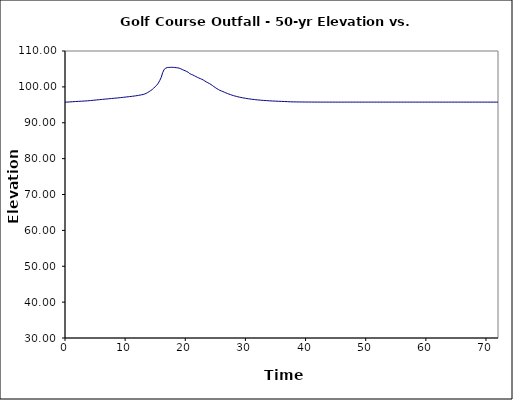
| Category | Series 1 |
|---|---|
| 0.0 | 95.75 |
| 0.25 | 95.754 |
| 0.5 | 95.771 |
| 0.75 | 95.799 |
| 1.0 | 95.83 |
| 1.25 | 95.86 |
| 1.5 | 95.888 |
| 1.75 | 95.915 |
| 2.0 | 95.94 |
| 2.25 | 95.962 |
| 2.5 | 95.985 |
| 2.75 | 96.007 |
| 3.0 | 96.029 |
| 3.25 | 96.054 |
| 3.5 | 96.084 |
| 3.75 | 96.117 |
| 4.0 | 96.154 |
| 4.25 | 96.191 |
| 4.5 | 96.232 |
| 4.75 | 96.272 |
| 5.0 | 96.313 |
| 5.25 | 96.355 |
| 5.5 | 96.395 |
| 5.75 | 96.437 |
| 6.0 | 96.479 |
| 6.25 | 96.519 |
| 6.5 | 96.561 |
| 6.75 | 96.602 |
| 7.0 | 96.642 |
| 7.25 | 96.683 |
| 7.5 | 96.722 |
| 7.75 | 96.762 |
| 8.0 | 96.801 |
| 8.25 | 96.841 |
| 8.5 | 96.88 |
| 8.75 | 96.92 |
| 9.0 | 96.962 |
| 9.25 | 97.005 |
| 9.5 | 97.051 |
| 9.75 | 97.099 |
| 10.0 | 97.148 |
| 10.25 | 97.198 |
| 10.5 | 97.244 |
| 10.75 | 97.29 |
| 11.0 | 97.336 |
| 11.25 | 97.388 |
| 11.5 | 97.444 |
| 11.75 | 97.502 |
| 12.0 | 97.568 |
| 12.25 | 97.638 |
| 12.5 | 97.715 |
| 12.75 | 97.799 |
| 13.0 | 97.891 |
| 13.25 | 98.015 |
| 13.5 | 98.196 |
| 13.75 | 98.427 |
| 14.0 | 98.688 |
| 14.25 | 98.965 |
| 14.5 | 99.263 |
| 14.75 | 99.665 |
| 15.0 | 100.061 |
| 15.25 | 100.449 |
| 15.5 | 100.999 |
| 15.75 | 101.752 |
| 16.0 | 102.668 |
| 16.25 | 104.013 |
| 16.5 | 104.884 |
| 16.75 | 105.211 |
| 17.0 | 105.377 |
| 17.25 | 105.421 |
| 17.5 | 105.449 |
| 17.75 | 105.453 |
| 18.0 | 105.442 |
| 18.25 | 105.406 |
| 18.5 | 105.355 |
| 18.75 | 105.292 |
| 19.0 | 105.213 |
| 19.25 | 105.041 |
| 19.5 | 104.818 |
| 19.75 | 104.645 |
| 20.0 | 104.481 |
| 20.25 | 104.279 |
| 20.5 | 104.048 |
| 20.75 | 103.698 |
| 21.0 | 103.483 |
| 21.25 | 103.336 |
| 21.5 | 103.101 |
| 21.75 | 102.89 |
| 22.0 | 102.678 |
| 22.25 | 102.484 |
| 22.5 | 102.301 |
| 22.75 | 102.121 |
| 23.0 | 101.901 |
| 23.25 | 101.641 |
| 23.5 | 101.389 |
| 23.75 | 101.151 |
| 24.0 | 100.926 |
| 24.25 | 100.682 |
| 24.5 | 100.392 |
| 24.75 | 100.082 |
| 25.0 | 99.788 |
| 25.25 | 99.52 |
| 25.5 | 99.269 |
| 25.75 | 99.036 |
| 26.0 | 98.86 |
| 26.25 | 98.701 |
| 26.5 | 98.508 |
| 26.75 | 98.325 |
| 27.0 | 98.156 |
| 27.25 | 97.997 |
| 27.5 | 97.849 |
| 27.75 | 97.709 |
| 28.0 | 97.575 |
| 28.25 | 97.455 |
| 28.5 | 97.343 |
| 28.75 | 97.24 |
| 29.0 | 97.142 |
| 29.25 | 97.053 |
| 29.5 | 96.968 |
| 29.75 | 96.889 |
| 30.0 | 96.815 |
| 30.25 | 96.747 |
| 30.5 | 96.683 |
| 30.75 | 96.623 |
| 31.0 | 96.565 |
| 31.25 | 96.514 |
| 31.5 | 96.464 |
| 31.75 | 96.417 |
| 32.0 | 96.376 |
| 32.25 | 96.335 |
| 32.5 | 96.297 |
| 32.75 | 96.261 |
| 33.0 | 96.228 |
| 33.25 | 96.197 |
| 33.5 | 96.168 |
| 33.75 | 96.141 |
| 34.0 | 96.114 |
| 34.25 | 96.091 |
| 34.5 | 96.067 |
| 34.75 | 96.045 |
| 35.0 | 96.025 |
| 35.25 | 96.006 |
| 35.5 | 95.987 |
| 35.75 | 95.969 |
| 36.0 | 95.954 |
| 36.25 | 95.937 |
| 36.5 | 95.922 |
| 36.75 | 95.905 |
| 37.0 | 95.883 |
| 37.25 | 95.858 |
| 37.5 | 95.837 |
| 37.75 | 95.827 |
| 38.0 | 95.818 |
| 38.25 | 95.811 |
| 38.5 | 95.804 |
| 38.75 | 95.799 |
| 39.0 | 95.793 |
| 39.25 | 95.789 |
| 39.5 | 95.785 |
| 39.75 | 95.781 |
| 40.0 | 95.778 |
| 40.25 | 95.775 |
| 40.5 | 95.772 |
| 40.75 | 95.77 |
| 41.0 | 95.768 |
| 41.25 | 95.765 |
| 41.5 | 95.764 |
| 41.75 | 95.763 |
| 42.0 | 95.761 |
| 42.25 | 95.76 |
| 42.5 | 95.758 |
| 42.75 | 95.757 |
| 43.0 | 95.756 |
| 43.25 | 95.756 |
| 43.5 | 95.754 |
| 43.75 | 95.753 |
| 44.0 | 95.753 |
| 44.25 | 95.751 |
| 44.5 | 95.751 |
| 44.75 | 95.75 |
| 45.0 | 95.75 |
| 45.25 | 95.75 |
| 45.5 | 95.75 |
| 45.75 | 95.75 |
| 46.0 | 95.75 |
| 46.25 | 95.75 |
| 46.5 | 95.75 |
| 46.75 | 95.75 |
| 47.0 | 95.75 |
| 47.25 | 95.75 |
| 47.5 | 95.75 |
| 47.75 | 95.75 |
| 48.0 | 95.75 |
| 48.25 | 95.75 |
| 48.5 | 95.75 |
| 48.75 | 95.75 |
| 49.0 | 95.75 |
| 49.25 | 95.75 |
| 49.5 | 95.75 |
| 49.75 | 95.75 |
| 50.0 | 95.75 |
| 50.25 | 95.75 |
| 50.5 | 95.75 |
| 50.75 | 95.75 |
| 51.0 | 95.75 |
| 51.25 | 95.75 |
| 51.5 | 95.75 |
| 51.75 | 95.75 |
| 52.0 | 95.75 |
| 52.25 | 95.75 |
| 52.5 | 95.75 |
| 52.75 | 95.75 |
| 53.0 | 95.75 |
| 53.25 | 95.75 |
| 53.5 | 95.75 |
| 53.75 | 95.75 |
| 54.0 | 95.75 |
| 54.25 | 95.75 |
| 54.5 | 95.75 |
| 54.75 | 95.75 |
| 55.0 | 95.75 |
| 55.25 | 95.75 |
| 55.5 | 95.75 |
| 55.75 | 95.75 |
| 56.0 | 95.75 |
| 56.25 | 95.75 |
| 56.5 | 95.75 |
| 56.75 | 95.75 |
| 57.0 | 95.75 |
| 57.25 | 95.75 |
| 57.5 | 95.75 |
| 57.75 | 95.75 |
| 58.0 | 95.75 |
| 58.25 | 95.75 |
| 58.5 | 95.75 |
| 58.75 | 95.75 |
| 59.0 | 95.75 |
| 59.25 | 95.75 |
| 59.5 | 95.75 |
| 59.75 | 95.75 |
| 60.0 | 95.75 |
| 60.25 | 95.75 |
| 60.5 | 95.75 |
| 60.75 | 95.75 |
| 61.0 | 95.75 |
| 61.25 | 95.75 |
| 61.5 | 95.75 |
| 61.75 | 95.75 |
| 62.0 | 95.75 |
| 62.25 | 95.75 |
| 62.5 | 95.75 |
| 62.75 | 95.75 |
| 63.0 | 95.75 |
| 63.25 | 95.75 |
| 63.5 | 95.75 |
| 63.75 | 95.75 |
| 64.0 | 95.75 |
| 64.25 | 95.75 |
| 64.5 | 95.75 |
| 64.75 | 95.75 |
| 65.0 | 95.75 |
| 65.25 | 95.75 |
| 65.5 | 95.75 |
| 65.75 | 95.75 |
| 66.0 | 95.75 |
| 66.25 | 95.75 |
| 66.5 | 95.75 |
| 66.75 | 95.75 |
| 67.0 | 95.75 |
| 67.25 | 95.75 |
| 67.5 | 95.75 |
| 67.75 | 95.75 |
| 68.0 | 95.75 |
| 68.25 | 95.75 |
| 68.5 | 95.75 |
| 68.75 | 95.75 |
| 69.0 | 95.75 |
| 69.25 | 95.75 |
| 69.5 | 95.75 |
| 69.75 | 95.75 |
| 70.0 | 95.75 |
| 70.25 | 95.75 |
| 70.5 | 95.75 |
| 70.75 | 95.75 |
| 71.0 | 95.75 |
| 71.25 | 95.75 |
| 71.5 | 95.75 |
| 71.75 | 95.75 |
| 72.0 | 95.75 |
| 72.25 | 95.75 |
| 72.5 | 95.75 |
| 72.75 | 95.75 |
| 73.0 | 95.75 |
| 73.25 | 95.75 |
| 73.5 | 95.75 |
| 73.75 | 95.75 |
| 74.0 | 95.75 |
| 74.25 | 95.75 |
| 74.5 | 95.75 |
| 74.75 | 95.75 |
| 75.0 | 95.75 |
| 75.25 | 95.75 |
| 75.5 | 95.75 |
| 75.75 | 95.75 |
| 76.0 | 95.75 |
| 76.25 | 95.75 |
| 76.5 | 95.75 |
| 76.75 | 95.75 |
| 77.0 | 95.75 |
| 77.25 | 95.75 |
| 77.5 | 95.75 |
| 77.75 | 95.75 |
| 78.0 | 95.75 |
| 78.25 | 95.75 |
| 78.5 | 95.75 |
| 78.75 | 95.75 |
| 79.0 | 95.75 |
| 79.25 | 95.75 |
| 79.5 | 95.75 |
| 79.75 | 95.75 |
| 80.0 | 95.75 |
| 80.25 | 95.75 |
| 80.5 | 95.75 |
| 80.75 | 95.75 |
| 81.0 | 95.75 |
| 81.25 | 95.75 |
| 81.5 | 95.75 |
| 81.75 | 95.75 |
| 82.0 | 95.75 |
| 82.25 | 95.75 |
| 82.5 | 95.75 |
| 82.75 | 95.75 |
| 83.0 | 95.75 |
| 83.25 | 95.75 |
| 83.5 | 95.75 |
| 83.75 | 95.75 |
| 84.0 | 95.75 |
| 84.25 | 95.75 |
| 84.5 | 95.75 |
| 84.75 | 95.75 |
| 85.0 | 95.75 |
| 85.25 | 95.75 |
| 85.5 | 95.75 |
| 85.75 | 95.75 |
| 86.0 | 95.75 |
| 86.25 | 95.75 |
| 86.5 | 95.75 |
| 86.75 | 95.75 |
| 87.0 | 95.75 |
| 87.25 | 95.75 |
| 87.5 | 95.75 |
| 87.75 | 95.75 |
| 88.0 | 95.75 |
| 88.25 | 95.75 |
| 88.5 | 95.75 |
| 88.75 | 95.75 |
| 89.0 | 95.75 |
| 89.25 | 95.75 |
| 89.5 | 95.75 |
| 89.75 | 95.75 |
| 90.0 | 95.75 |
| 90.25 | 95.75 |
| 90.5 | 95.75 |
| 90.75 | 95.75 |
| 91.0 | 95.75 |
| 91.25 | 95.75 |
| 91.5 | 95.75 |
| 91.75 | 95.75 |
| 92.0 | 95.75 |
| 92.25 | 95.75 |
| 92.5 | 95.75 |
| 92.75 | 95.75 |
| 93.0 | 95.75 |
| 93.25 | 95.75 |
| 93.5 | 95.75 |
| 93.75 | 95.75 |
| 94.0 | 95.75 |
| 94.25 | 95.75 |
| 94.5 | 95.75 |
| 94.75 | 95.75 |
| 95.0 | 95.75 |
| 95.25 | 95.75 |
| 95.5 | 95.75 |
| 95.75 | 95.75 |
| 96.0 | 95.75 |
| 96.25 | 95.75 |
| 96.5 | 95.75 |
| 96.75 | 95.75 |
| 97.0 | 95.75 |
| 97.25 | 95.75 |
| 97.5 | 95.75 |
| 97.75 | 95.75 |
| 98.0 | 95.75 |
| 98.25 | 95.75 |
| 98.5 | 95.75 |
| 98.75 | 95.75 |
| 99.0 | 95.75 |
| 99.25 | 95.75 |
| 99.5 | 95.75 |
| 99.75 | 95.75 |
| 100.0 | 95.75 |
| 100.25 | 95.75 |
| 100.5 | 95.75 |
| 100.75 | 95.75 |
| 101.0 | 95.75 |
| 101.25 | 95.75 |
| 101.5 | 95.75 |
| 101.75 | 95.75 |
| 102.0 | 95.75 |
| 102.25 | 95.75 |
| 102.5 | 95.75 |
| 102.75 | 95.75 |
| 103.0 | 95.75 |
| 103.25 | 95.75 |
| 103.5 | 95.75 |
| 103.75 | 95.75 |
| 104.0 | 95.75 |
| 104.25 | 95.75 |
| 104.5 | 95.75 |
| 104.75 | 95.75 |
| 105.0 | 95.75 |
| 105.25 | 95.75 |
| 105.5 | 95.75 |
| 105.75 | 95.75 |
| 106.0 | 95.75 |
| 106.25 | 95.75 |
| 106.5 | 95.75 |
| 106.75 | 95.75 |
| 107.0 | 95.75 |
| 107.25 | 95.75 |
| 107.5 | 95.75 |
| 107.75 | 95.75 |
| 108.0 | 95.75 |
| 108.25 | 95.75 |
| 108.5 | 95.75 |
| 108.75 | 95.75 |
| 109.0 | 95.75 |
| 109.25 | 95.75 |
| 109.5 | 95.75 |
| 109.75 | 95.75 |
| 110.0 | 95.75 |
| 110.25 | 95.75 |
| 110.5 | 95.75 |
| 110.75 | 95.75 |
| 111.0 | 95.75 |
| 111.25 | 95.75 |
| 111.5 | 95.75 |
| 111.75 | 95.75 |
| 112.0 | 95.75 |
| 112.25 | 95.75 |
| 112.5 | 95.75 |
| 112.75 | 95.75 |
| 113.0 | 95.75 |
| 113.25 | 95.75 |
| 113.5 | 95.75 |
| 113.75 | 95.75 |
| 114.0 | 95.75 |
| 114.25 | 95.75 |
| 114.5 | 95.75 |
| 114.75 | 95.75 |
| 115.0 | 95.75 |
| 115.25 | 95.75 |
| 115.5 | 95.75 |
| 115.75 | 95.75 |
| 116.0 | 95.75 |
| 116.25 | 95.75 |
| 116.5 | 95.75 |
| 116.75 | 95.75 |
| 117.0 | 95.75 |
| 117.25 | 95.75 |
| 117.5 | 95.75 |
| 117.75 | 95.75 |
| 118.0 | 95.75 |
| 118.25 | 95.75 |
| 118.5 | 95.75 |
| 118.75 | 95.75 |
| 119.0 | 95.75 |
| 119.25 | 95.75 |
| 119.5 | 95.75 |
| 119.75 | 95.75 |
| 120.0 | 95.75 |
| 120.25 | 95.75 |
| 120.5 | 95.75 |
| 120.75 | 95.75 |
| 121.0 | 95.75 |
| 121.25 | 95.75 |
| 121.5 | 95.75 |
| 121.75 | 95.75 |
| 122.0 | 95.75 |
| 122.25 | 95.75 |
| 122.5 | 95.75 |
| 122.75 | 95.75 |
| 123.0 | 95.75 |
| 123.25 | 95.75 |
| 123.5 | 95.75 |
| 123.75 | 95.75 |
| 124.0 | 95.75 |
| 124.25 | 95.75 |
| 124.5 | 95.75 |
| 124.75 | 95.75 |
| 125.0 | 95.75 |
| 125.25 | 95.75 |
| 125.5 | 95.75 |
| 125.75 | 95.75 |
| 126.0 | 95.75 |
| 126.25 | 95.75 |
| 126.5 | 95.75 |
| 126.75 | 95.75 |
| 127.0 | 95.75 |
| 127.25 | 95.75 |
| 127.5 | 95.75 |
| 127.75 | 95.75 |
| 128.0 | 95.75 |
| 128.25 | 95.75 |
| 128.5 | 95.75 |
| 128.75 | 95.75 |
| 129.0 | 95.75 |
| 129.25 | 95.75 |
| 129.5 | 95.75 |
| 129.75 | 95.75 |
| 130.0 | 95.75 |
| 130.25 | 95.75 |
| 130.5 | 95.75 |
| 130.75 | 95.75 |
| 131.0 | 95.75 |
| 131.25 | 95.75 |
| 131.5 | 95.75 |
| 131.75 | 95.75 |
| 132.0 | 95.75 |
| 132.25 | 95.75 |
| 132.5 | 95.75 |
| 132.75 | 95.75 |
| 133.0 | 95.75 |
| 133.25 | 95.75 |
| 133.5 | 95.75 |
| 133.75 | 95.75 |
| 134.0 | 95.75 |
| 134.25 | 95.75 |
| 134.5 | 95.75 |
| 134.75 | 95.75 |
| 135.0 | 95.75 |
| 135.25 | 95.75 |
| 135.5 | 95.75 |
| 135.75 | 95.75 |
| 136.0 | 95.75 |
| 136.25 | 95.75 |
| 136.5 | 95.75 |
| 136.75 | 95.75 |
| 137.0 | 95.75 |
| 137.25 | 95.75 |
| 137.5 | 95.75 |
| 137.75 | 95.75 |
| 138.0 | 95.75 |
| 138.25 | 95.75 |
| 138.5 | 95.75 |
| 138.75 | 95.75 |
| 139.0 | 95.75 |
| 139.25 | 95.75 |
| 139.5 | 95.75 |
| 139.75 | 95.75 |
| 140.0 | 95.75 |
| 140.25 | 95.75 |
| 140.5 | 95.75 |
| 140.75 | 95.75 |
| 141.0 | 95.75 |
| 141.25 | 95.75 |
| 141.5 | 95.75 |
| 141.75 | 95.75 |
| 142.0 | 95.75 |
| 142.25 | 95.75 |
| 142.5 | 95.75 |
| 142.75 | 95.75 |
| 143.0 | 95.75 |
| 143.25 | 95.75 |
| 143.5 | 95.75 |
| 143.75 | 95.75 |
| 144.0 | 95.75 |
| 144.25 | 95.75 |
| 144.5 | 95.75 |
| 144.75 | 95.75 |
| 145.0 | 95.75 |
| 145.25 | 95.75 |
| 145.5 | 95.75 |
| 145.75 | 95.75 |
| 146.0 | 95.75 |
| 146.25 | 95.75 |
| 146.5 | 95.75 |
| 146.75 | 95.75 |
| 147.0 | 95.75 |
| 147.25 | 95.75 |
| 147.5 | 95.75 |
| 147.75 | 95.75 |
| 148.0 | 95.75 |
| 148.25 | 95.75 |
| 148.5 | 95.75 |
| 148.75 | 95.75 |
| 149.0 | 95.75 |
| 149.25 | 95.75 |
| 149.5 | 95.75 |
| 149.75 | 95.75 |
| 150.0 | 95.75 |
| 150.25 | 95.75 |
| 150.5 | 95.75 |
| 150.75 | 95.75 |
| 151.0 | 95.75 |
| 151.25 | 95.75 |
| 151.5 | 95.75 |
| 151.75 | 95.75 |
| 152.0 | 95.75 |
| 152.25 | 95.75 |
| 152.5 | 95.75 |
| 152.75 | 95.75 |
| 153.0 | 95.75 |
| 153.25 | 95.75 |
| 153.5 | 95.75 |
| 153.75 | 95.75 |
| 154.0 | 95.75 |
| 154.25 | 95.75 |
| 154.5 | 95.75 |
| 154.75 | 95.75 |
| 155.0 | 95.75 |
| 155.25 | 95.75 |
| 155.5 | 95.75 |
| 155.75 | 95.75 |
| 156.0 | 95.75 |
| 156.25 | 95.75 |
| 156.5 | 95.75 |
| 156.75 | 95.75 |
| 157.0 | 95.75 |
| 157.25 | 95.75 |
| 157.5 | 95.75 |
| 157.75 | 95.75 |
| 158.0 | 95.75 |
| 158.25 | 95.75 |
| 158.5 | 95.75 |
| 158.75 | 95.75 |
| 159.0 | 95.75 |
| 159.25 | 95.75 |
| 159.5 | 95.75 |
| 159.75 | 95.75 |
| 160.0 | 95.75 |
| 160.25 | 95.75 |
| 160.5 | 95.75 |
| 160.75 | 95.75 |
| 161.0 | 95.75 |
| 161.25 | 95.75 |
| 161.5 | 95.75 |
| 161.75 | 95.75 |
| 162.0 | 95.75 |
| 162.25 | 95.75 |
| 162.5 | 95.75 |
| 162.75 | 95.75 |
| 163.0 | 95.75 |
| 163.25 | 95.75 |
| 163.5 | 95.75 |
| 163.75 | 95.75 |
| 164.0 | 95.75 |
| 164.25 | 95.75 |
| 164.5 | 95.75 |
| 164.75 | 95.75 |
| 165.0 | 95.75 |
| 165.25 | 95.75 |
| 165.5 | 95.75 |
| 165.75 | 95.75 |
| 166.0 | 95.75 |
| 166.25 | 95.75 |
| 166.5 | 95.75 |
| 166.75 | 95.75 |
| 167.0 | 95.75 |
| 167.25 | 95.75 |
| 167.5 | 95.75 |
| 167.75 | 95.75 |
| 168.0 | 95.75 |
| 168.25 | 95.75 |
| 168.5 | 95.75 |
| 168.75 | 95.75 |
| 169.0 | 95.75 |
| 169.25 | 95.75 |
| 169.5 | 95.75 |
| 169.75 | 95.75 |
| 170.0 | 95.75 |
| 170.25 | 95.75 |
| 170.5 | 95.75 |
| 170.75 | 95.75 |
| 171.0 | 95.75 |
| 171.25 | 95.75 |
| 171.5 | 95.75 |
| 171.75 | 95.75 |
| 172.0 | 95.75 |
| 172.25 | 95.75 |
| 172.5 | 95.75 |
| 172.75 | 95.75 |
| 173.0 | 95.75 |
| 173.25 | 95.75 |
| 173.5 | 95.75 |
| 173.75 | 95.75 |
| 174.0 | 95.75 |
| 174.25 | 95.75 |
| 174.5 | 95.75 |
| 174.75 | 95.75 |
| 175.0 | 95.75 |
| 175.25 | 95.75 |
| 175.5 | 95.75 |
| 175.75 | 95.75 |
| 176.0 | 95.75 |
| 176.25 | 95.75 |
| 176.5 | 95.75 |
| 176.75 | 95.75 |
| 177.0 | 95.75 |
| 177.25 | 95.75 |
| 177.5 | 95.75 |
| 177.75 | 95.75 |
| 178.0 | 95.75 |
| 178.25 | 95.75 |
| 178.5 | 95.75 |
| 178.75 | 95.75 |
| 179.0 | 95.75 |
| 179.25 | 95.75 |
| 179.5 | 95.75 |
| 179.75 | 95.75 |
| 180.0 | 95.75 |
| 180.25 | 95.75 |
| 180.5 | 95.75 |
| 180.75 | 95.75 |
| 181.0 | 95.75 |
| 181.25 | 95.75 |
| 181.5 | 95.75 |
| 181.75 | 95.75 |
| 182.0 | 95.75 |
| 182.25 | 95.75 |
| 182.5 | 95.75 |
| 182.75 | 95.75 |
| 183.0 | 95.75 |
| 183.25 | 95.75 |
| 183.5 | 95.75 |
| 183.75 | 95.75 |
| 184.0 | 95.75 |
| 184.25 | 95.75 |
| 184.5 | 95.75 |
| 184.75 | 95.75 |
| 185.0 | 95.75 |
| 185.25 | 95.75 |
| 185.5 | 95.75 |
| 185.75 | 95.75 |
| 186.0 | 95.75 |
| 186.25 | 95.75 |
| 186.5 | 95.75 |
| 186.75 | 95.75 |
| 187.0 | 95.75 |
| 187.25 | 95.75 |
| 187.5 | 95.75 |
| 187.75 | 95.75 |
| 188.0 | 95.75 |
| 188.25 | 95.75 |
| 188.5 | 95.75 |
| 188.75 | 95.75 |
| 189.0 | 95.75 |
| 189.25 | 95.75 |
| 189.5 | 95.75 |
| 189.75 | 95.75 |
| 190.0 | 95.75 |
| 190.25 | 95.75 |
| 190.5 | 95.75 |
| 190.75 | 95.75 |
| 191.0 | 95.75 |
| 191.25 | 95.75 |
| 191.5 | 95.75 |
| 191.75 | 95.75 |